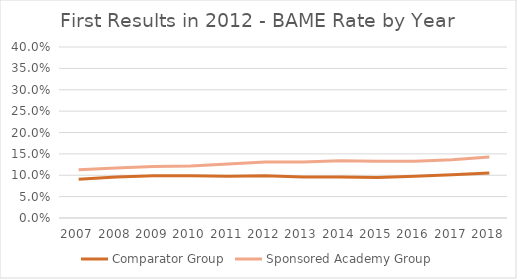
| Category | Comparator Group | Sponsored Academy Group |
|---|---|---|
| 2007.0 | 0.091 | 0.113 |
| 2008.0 | 0.096 | 0.117 |
| 2009.0 | 0.099 | 0.12 |
| 2010.0 | 0.099 | 0.121 |
| 2011.0 | 0.098 | 0.126 |
| 2012.0 | 0.099 | 0.131 |
| 2013.0 | 0.096 | 0.131 |
| 2014.0 | 0.096 | 0.134 |
| 2015.0 | 0.095 | 0.133 |
| 2016.0 | 0.098 | 0.133 |
| 2017.0 | 0.101 | 0.136 |
| 2018.0 | 0.106 | 0.143 |